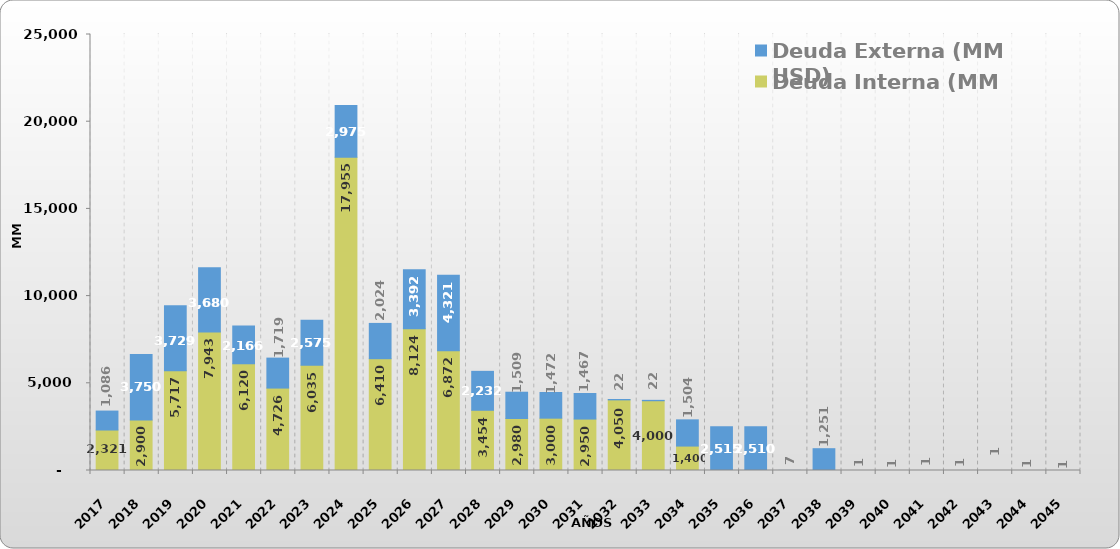
| Category | Deuda Interna (MM USD) | Deuda Externa (MM USD) |
|---|---|---|
| 2017.0 | 2321.248 | 1086.162 |
| 2018.0 | 2900.371 | 3750.161 |
| 2019.0 | 5716.796 | 3729.345 |
| 2020.0 | 7943.045 | 3679.989 |
| 2021.0 | 6119.69 | 2165.802 |
| 2022.0 | 4725.892 | 1718.715 |
| 2023.0 | 6034.526 | 2574.731 |
| 2024.0 | 17954.526 | 2975.39 |
| 2025.0 | 6410.189 | 2023.895 |
| 2026.0 | 8123.655 | 3391.741 |
| 2027.0 | 6872.248 | 4320.545 |
| 2028.0 | 3453.742 | 2231.816 |
| 2029.0 | 2980 | 1508.543 |
| 2030.0 | 3000 | 1471.835 |
| 2031.0 | 2950 | 1466.753 |
| 2032.0 | 4050 | 22.411 |
| 2033.0 | 4000 | 22.045 |
| 2034.0 | 1400 | 1504.201 |
| 2035.0 | 0 | 2515.201 |
| 2036.0 | 0 | 2510.132 |
| 2037.0 | 0 | 6.681 |
| 2038.0 | 0 | 1250.711 |
| 2039.0 | 0 | 0.708 |
| 2040.0 | 0 | 0.708 |
| 2041.0 | 0 | 0.708 |
| 2042.0 | 0 | 0.708 |
| 2043.0 | 0 | 0.708 |
| 2044.0 | 0 | 0.708 |
| 2045.0 | 0 | 0.708 |